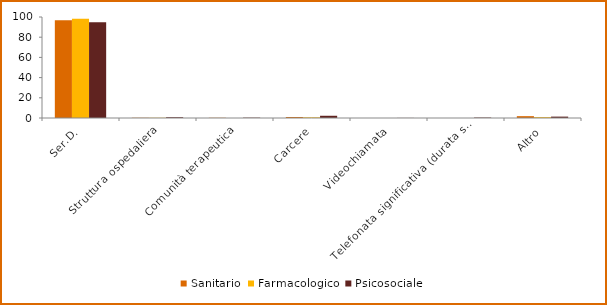
| Category | Sanitario | Farmacologico | Psicosociale |
|---|---|---|---|
| Ser.D. | 96.697 | 98.244 | 94.731 |
| Struttura ospedaliera | 0.246 | 0.241 | 0.783 |
| Comunità terapeutica | 0.226 | 0.007 | 0.351 |
| Carcere | 0.989 | 0.66 | 2.212 |
| Videochiamata | 0.005 | 0 | 0.101 |
| Telefonata significativa (durata superiore ai 15 minuti) | 0.004 | 0 | 0.454 |
| Altro | 1.832 | 0.847 | 1.369 |